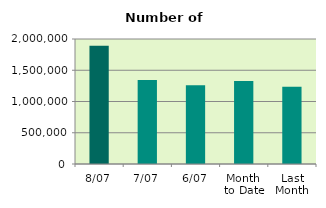
| Category | Series 0 |
|---|---|
| 8/07 | 1890608 |
| 7/07 | 1345558 |
| 6/07 | 1259378 |
| Month 
to Date | 1327874.333 |
| Last
Month | 1237407.909 |